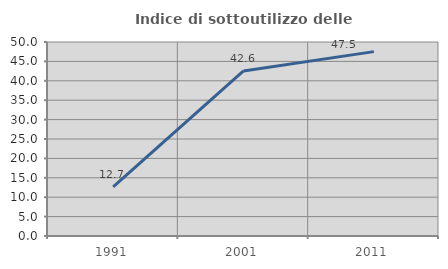
| Category | Indice di sottoutilizzo delle abitazioni  |
|---|---|
| 1991.0 | 12.667 |
| 2001.0 | 42.553 |
| 2011.0 | 47.518 |